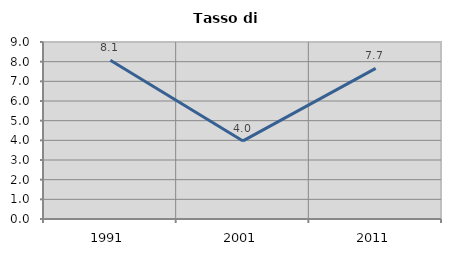
| Category | Tasso di disoccupazione   |
|---|---|
| 1991.0 | 8.075 |
| 2001.0 | 3.969 |
| 2011.0 | 7.662 |